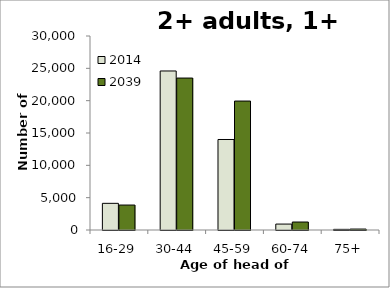
| Category | 2014 | 2039 |
|---|---|---|
| 16-29 | 4123 | 3859 |
| 30-44 | 24591 | 23497 |
| 45-59 | 13995 | 19941 |
| 60-74 | 916 | 1233 |
| 75+ | 101 | 147 |